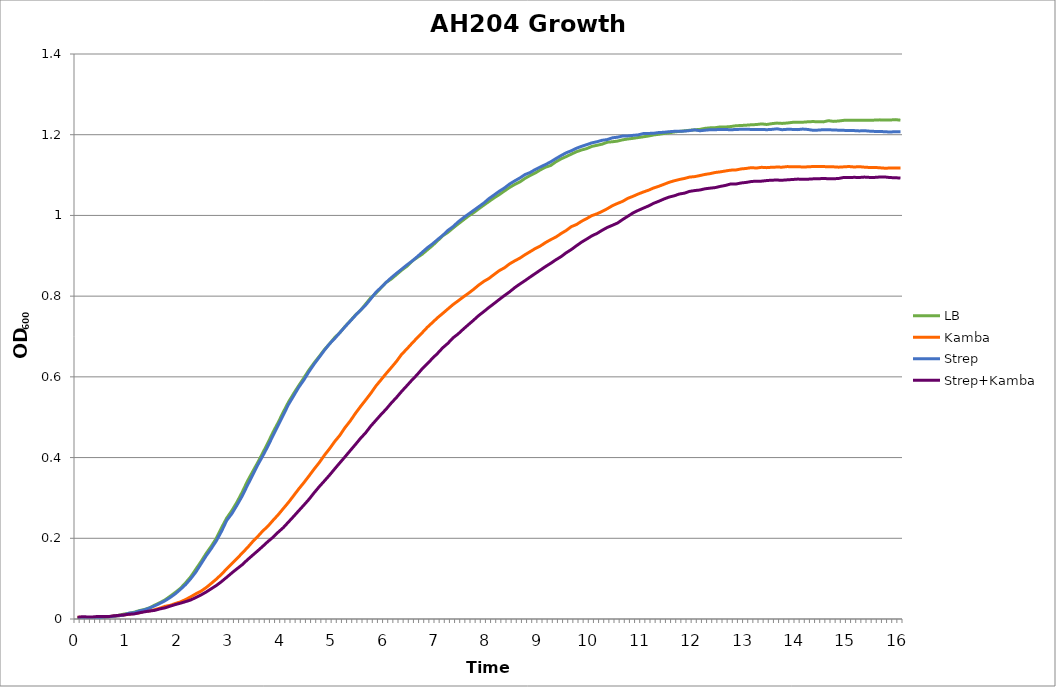
| Category | LB | Kamba | Strep | Strep+Kamba |
|---|---|---|---|---|
| 0.0 | 0.002 | 0.004 | 0.001 | 0.004 |
| nan | 0.004 | 0.004 | 0.002 | 0.006 |
| nan | 0.003 | 0.004 | 0.003 | 0.005 |
| nan | 0.004 | 0.003 | 0.002 | 0.005 |
| nan | 0.004 | 0.005 | 0.003 | 0.006 |
| nan | 0.004 | 0.005 | 0.004 | 0.006 |
| nan | 0.006 | 0.006 | 0.005 | 0.006 |
| nan | 0.007 | 0.007 | 0.007 | 0.008 |
| nan | 0.009 | 0.008 | 0.008 | 0.009 |
| nan | 0.012 | 0.01 | 0.01 | 0.01 |
| 1.0 | 0.014 | 0.012 | 0.014 | 0.012 |
| nan | 0.017 | 0.014 | 0.016 | 0.013 |
| nan | 0.021 | 0.015 | 0.02 | 0.015 |
| nan | 0.024 | 0.019 | 0.023 | 0.018 |
| nan | 0.028 | 0.02 | 0.027 | 0.02 |
| nan | 0.034 | 0.023 | 0.033 | 0.021 |
| nan | 0.04 | 0.027 | 0.039 | 0.025 |
| nan | 0.047 | 0.031 | 0.045 | 0.028 |
| nan | 0.056 | 0.034 | 0.053 | 0.032 |
| nan | 0.066 | 0.038 | 0.062 | 0.036 |
| 2.0 | 0.076 | 0.042 | 0.073 | 0.039 |
| nan | 0.09 | 0.048 | 0.085 | 0.043 |
| nan | 0.105 | 0.055 | 0.1 | 0.047 |
| nan | 0.123 | 0.062 | 0.116 | 0.053 |
| nan | 0.142 | 0.069 | 0.136 | 0.06 |
| nan | 0.162 | 0.078 | 0.156 | 0.067 |
| nan | 0.18 | 0.088 | 0.174 | 0.075 |
| nan | 0.2 | 0.099 | 0.194 | 0.083 |
| nan | 0.226 | 0.111 | 0.217 | 0.093 |
| nan | 0.25 | 0.124 | 0.244 | 0.103 |
| 3.0 | 0.269 | 0.137 | 0.261 | 0.114 |
| nan | 0.29 | 0.15 | 0.282 | 0.124 |
| nan | 0.314 | 0.163 | 0.304 | 0.134 |
| nan | 0.341 | 0.176 | 0.33 | 0.146 |
| nan | 0.364 | 0.191 | 0.355 | 0.158 |
| nan | 0.387 | 0.204 | 0.381 | 0.169 |
| nan | 0.411 | 0.218 | 0.404 | 0.18 |
| nan | 0.436 | 0.23 | 0.428 | 0.192 |
| nan | 0.463 | 0.244 | 0.454 | 0.202 |
| nan | 0.487 | 0.258 | 0.48 | 0.215 |
| 4.0 | 0.513 | 0.274 | 0.505 | 0.226 |
| nan | 0.537 | 0.289 | 0.531 | 0.24 |
| nan | 0.558 | 0.305 | 0.553 | 0.254 |
| nan | 0.578 | 0.322 | 0.574 | 0.268 |
| nan | 0.597 | 0.338 | 0.592 | 0.282 |
| nan | 0.617 | 0.354 | 0.613 | 0.297 |
| nan | 0.635 | 0.372 | 0.632 | 0.313 |
| nan | 0.651 | 0.388 | 0.649 | 0.328 |
| nan | 0.668 | 0.406 | 0.666 | 0.342 |
| nan | 0.682 | 0.422 | 0.682 | 0.357 |
| 5.0 | 0.697 | 0.44 | 0.695 | 0.372 |
| nan | 0.71 | 0.455 | 0.71 | 0.387 |
| nan | 0.725 | 0.474 | 0.724 | 0.402 |
| nan | 0.738 | 0.49 | 0.738 | 0.417 |
| nan | 0.753 | 0.509 | 0.752 | 0.432 |
| nan | 0.765 | 0.526 | 0.765 | 0.447 |
| nan | 0.78 | 0.542 | 0.778 | 0.461 |
| nan | 0.796 | 0.559 | 0.793 | 0.478 |
| nan | 0.807 | 0.577 | 0.81 | 0.492 |
| nan | 0.821 | 0.593 | 0.821 | 0.507 |
| 6.0 | 0.834 | 0.608 | 0.834 | 0.52 |
| nan | 0.842 | 0.623 | 0.846 | 0.535 |
| nan | 0.853 | 0.638 | 0.856 | 0.549 |
| nan | 0.864 | 0.656 | 0.867 | 0.564 |
| nan | 0.874 | 0.669 | 0.877 | 0.578 |
| nan | 0.886 | 0.683 | 0.886 | 0.592 |
| nan | 0.895 | 0.696 | 0.897 | 0.605 |
| nan | 0.904 | 0.709 | 0.909 | 0.62 |
| nan | 0.915 | 0.723 | 0.92 | 0.632 |
| nan | 0.925 | 0.735 | 0.929 | 0.646 |
| 7.0 | 0.937 | 0.747 | 0.94 | 0.658 |
| nan | 0.949 | 0.757 | 0.951 | 0.672 |
| nan | 0.958 | 0.768 | 0.963 | 0.683 |
| nan | 0.969 | 0.779 | 0.972 | 0.697 |
| nan | 0.979 | 0.788 | 0.984 | 0.706 |
| nan | 0.989 | 0.798 | 0.994 | 0.718 |
| nan | 0.998 | 0.807 | 1.003 | 0.729 |
| nan | 1.007 | 0.817 | 1.012 | 0.74 |
| nan | 1.016 | 0.827 | 1.022 | 0.752 |
| nan | 1.026 | 0.837 | 1.031 | 0.762 |
| 8.0 | 1.035 | 0.844 | 1.042 | 0.772 |
| nan | 1.044 | 0.854 | 1.051 | 0.782 |
| nan | 1.052 | 0.863 | 1.06 | 0.792 |
| nan | 1.061 | 0.87 | 1.068 | 0.801 |
| nan | 1.069 | 0.88 | 1.078 | 0.811 |
| nan | 1.077 | 0.887 | 1.086 | 0.821 |
| nan | 1.083 | 0.894 | 1.093 | 0.83 |
| nan | 1.092 | 0.903 | 1.101 | 0.838 |
| nan | 1.099 | 0.91 | 1.106 | 0.847 |
| nan | 1.105 | 0.918 | 1.114 | 0.856 |
| 9.0 | 1.113 | 0.924 | 1.12 | 0.865 |
| nan | 1.12 | 0.933 | 1.126 | 0.873 |
| nan | 1.124 | 0.94 | 1.133 | 0.881 |
| nan | 1.133 | 0.946 | 1.141 | 0.89 |
| nan | 1.14 | 0.955 | 1.148 | 0.898 |
| nan | 1.146 | 0.963 | 1.155 | 0.907 |
| nan | 1.152 | 0.972 | 1.16 | 0.915 |
| nan | 1.158 | 0.977 | 1.166 | 0.925 |
| nan | 1.162 | 0.986 | 1.171 | 0.934 |
| nan | 1.166 | 0.992 | 1.175 | 0.941 |
| 10.0 | 1.171 | 1 | 1.18 | 0.949 |
| nan | 1.174 | 1.004 | 1.183 | 0.955 |
| nan | 1.177 | 1.01 | 1.186 | 0.963 |
| nan | 1.181 | 1.017 | 1.188 | 0.97 |
| nan | 1.183 | 1.024 | 1.192 | 0.976 |
| nan | 1.184 | 1.03 | 1.194 | 0.981 |
| nan | 1.187 | 1.035 | 1.197 | 0.99 |
| nan | 1.189 | 1.042 | 1.197 | 0.998 |
| nan | 1.191 | 1.047 | 1.198 | 1.006 |
| nan | 1.193 | 1.053 | 1.2 | 1.012 |
| 11.0 | 1.195 | 1.058 | 1.203 | 1.018 |
| nan | 1.197 | 1.062 | 1.203 | 1.023 |
| nan | 1.199 | 1.068 | 1.204 | 1.03 |
| nan | 1.201 | 1.072 | 1.205 | 1.035 |
| nan | 1.203 | 1.077 | 1.206 | 1.041 |
| nan | 1.205 | 1.082 | 1.207 | 1.045 |
| nan | 1.207 | 1.086 | 1.208 | 1.049 |
| nan | 1.208 | 1.089 | 1.208 | 1.053 |
| nan | 1.21 | 1.092 | 1.209 | 1.055 |
| nan | 1.211 | 1.095 | 1.21 | 1.06 |
| 12.0 | 1.212 | 1.096 | 1.212 | 1.062 |
| nan | 1.213 | 1.099 | 1.21 | 1.063 |
| nan | 1.216 | 1.102 | 1.211 | 1.066 |
| nan | 1.217 | 1.104 | 1.212 | 1.068 |
| nan | 1.217 | 1.106 | 1.212 | 1.069 |
| nan | 1.219 | 1.108 | 1.213 | 1.072 |
| nan | 1.219 | 1.11 | 1.213 | 1.074 |
| nan | 1.22 | 1.112 | 1.212 | 1.078 |
| nan | 1.222 | 1.113 | 1.213 | 1.078 |
| nan | 1.223 | 1.115 | 1.213 | 1.08 |
| 13.0 | 1.224 | 1.116 | 1.214 | 1.082 |
| nan | 1.225 | 1.118 | 1.213 | 1.084 |
| nan | 1.225 | 1.117 | 1.213 | 1.085 |
| nan | 1.227 | 1.119 | 1.213 | 1.085 |
| nan | 1.225 | 1.118 | 1.212 | 1.086 |
| nan | 1.227 | 1.119 | 1.213 | 1.087 |
| nan | 1.229 | 1.12 | 1.215 | 1.088 |
| nan | 1.228 | 1.12 | 1.212 | 1.087 |
| nan | 1.229 | 1.121 | 1.213 | 1.088 |
| nan | 1.231 | 1.121 | 1.213 | 1.089 |
| 14.0 | 1.231 | 1.121 | 1.213 | 1.09 |
| nan | 1.231 | 1.12 | 1.214 | 1.09 |
| nan | 1.232 | 1.12 | 1.213 | 1.09 |
| nan | 1.233 | 1.121 | 1.211 | 1.091 |
| nan | 1.232 | 1.121 | 1.211 | 1.091 |
| nan | 1.232 | 1.121 | 1.212 | 1.092 |
| nan | 1.235 | 1.12 | 1.212 | 1.091 |
| nan | 1.233 | 1.12 | 1.212 | 1.091 |
| nan | 1.234 | 1.12 | 1.211 | 1.092 |
| nan | 1.236 | 1.12 | 1.211 | 1.094 |
| 15.0 | 1.236 | 1.121 | 1.21 | 1.094 |
| nan | 1.236 | 1.12 | 1.21 | 1.094 |
| nan | 1.236 | 1.121 | 1.209 | 1.094 |
| nan | 1.236 | 1.12 | 1.21 | 1.095 |
| nan | 1.236 | 1.119 | 1.209 | 1.094 |
| nan | 1.236 | 1.119 | 1.208 | 1.094 |
| nan | 1.237 | 1.118 | 1.208 | 1.095 |
| nan | 1.236 | 1.117 | 1.207 | 1.095 |
| nan | 1.236 | 1.117 | 1.207 | 1.094 |
| nan | 1.237 | 1.118 | 1.208 | 1.093 |
| 16.0 | 1.236 | 1.117 | 1.207 | 1.093 |